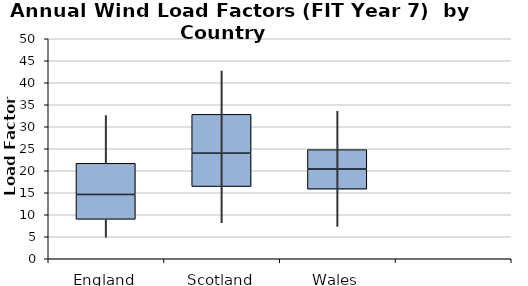
| Category | Series 0 | Series 1 | Series 2 |
|---|---|---|---|
| 0 | 8.97 | 5.64 | 7.08 |
| 1 | 16.41 | 7.58 | 8.83 |
| 2 | 15.82 | 4.56 | 4.42 |